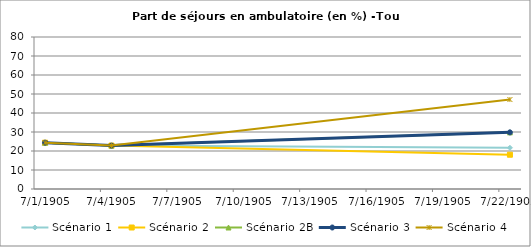
| Category | Scénario 1 | Scénario 2 | Scénario 2B | Scénario 3 | Scénario 4 |
|---|---|---|---|---|---|
| 2009.0 | 24.389 | 24.389 | 24.389 | 24.389 | 24.389 |
| 2012.0 | 22.849 | 22.849 | 22.849 | 22.849 | 22.849 |
| 2030.0 | 21.685 | 18.036 | 29.807 | 29.807 | 47.083 |